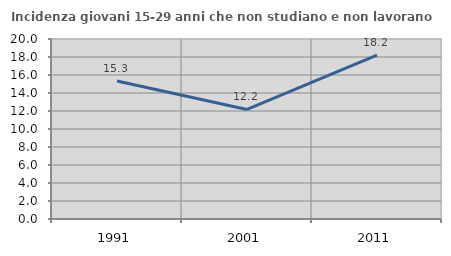
| Category | Incidenza giovani 15-29 anni che non studiano e non lavorano  |
|---|---|
| 1991.0 | 15.331 |
| 2001.0 | 12.174 |
| 2011.0 | 18.199 |